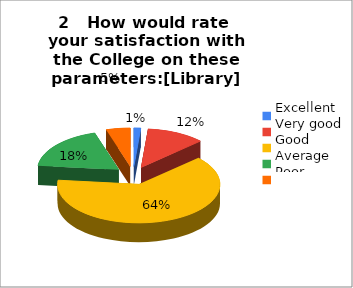
| Category | 2   How would rate 
your satisfaction with the College on these parameters:[Library] |
|---|---|
| Excellent | 2 |
| Very good | 17 |
| Good | 93 |
| Average | 27 |
| Poor | 7 |